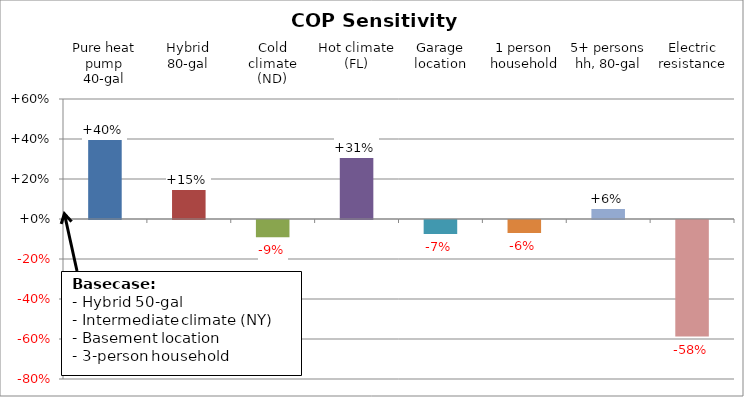
| Category | Series 0 |
|---|---|
| Pure heat pump 40-gal | 0.401 |
| Hybrid 80-gal | 0.151 |
| Cold climate (ND) | -0.086 |
| Hot climate (FL) | 0.31 |
| Garage location | -0.069 |
| 1 person household | -0.064 |
| 5+ persons hh, 80-gal | 0.057 |
| Electric resistance | -0.583 |